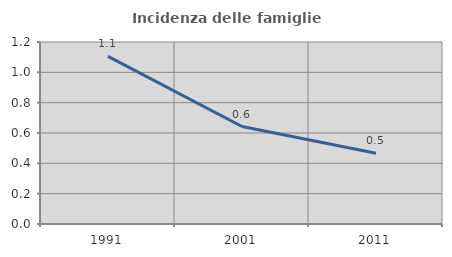
| Category | Incidenza delle famiglie numerose |
|---|---|
| 1991.0 | 1.105 |
| 2001.0 | 0.643 |
| 2011.0 | 0.466 |